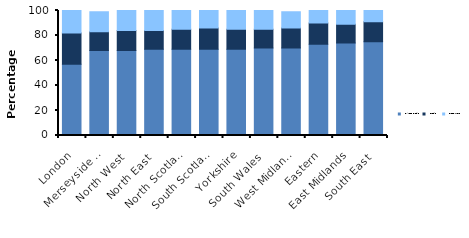
| Category | Direct Debit | Credit | Prepayment |
|---|---|---|---|
| London | 57 | 25 | 18 |
| Merseyside & North Wales | 68 | 15 | 16 |
| North West | 68 | 16 | 16 |
| North East | 69 | 15 | 16 |
| North Scotland | 69 | 16 | 15 |
| South Scotland | 69 | 17 | 14 |
| Yorkshire | 69 | 16 | 15 |
| South Wales | 70 | 15 | 15 |
| West Midlands | 70 | 16 | 13 |
| Eastern | 73 | 17 | 10 |
| East Midlands | 74 | 15 | 11 |
| South East | 75 | 16 | 10 |